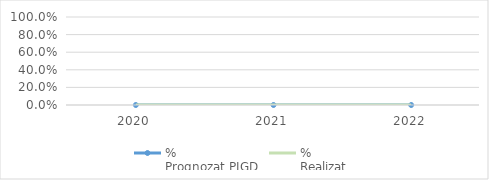
| Category | % 
Prognozat PJGD | % 
Realizat |
|---|---|---|
| 2020.0 | 0 | 0 |
| 2021.0 | 0 | 0 |
| 2022.0 | 0 | 0 |